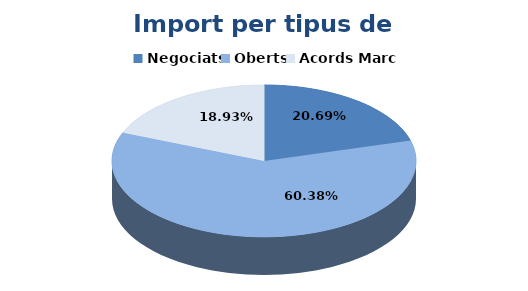
| Category | Series 0 |
|---|---|
| Negociats | 639500 |
| Oberts | 1866272.73 |
| Acords Marc | 585287.16 |